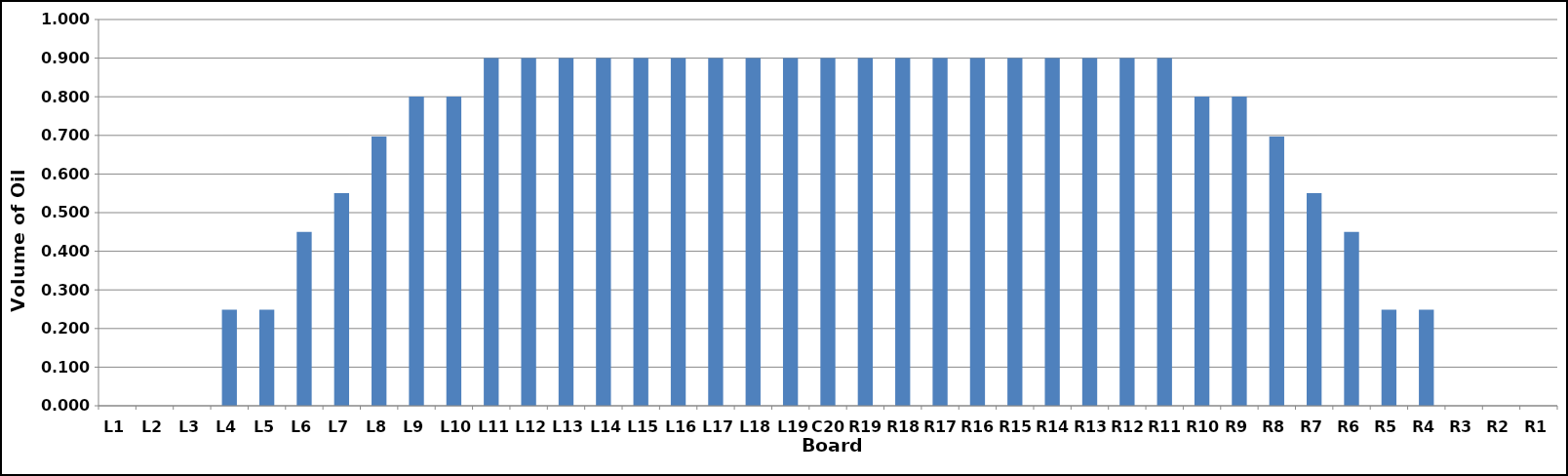
| Category | Series 0 |
|---|---|
| L1 | 0 |
| L2 | 0 |
| L3 | 0 |
| L4 | 0.249 |
| L5 | 0.249 |
| L6 | 0.45 |
| L7 | 0.551 |
| L8 | 0.697 |
| L9 | 0.801 |
| L10 | 0.801 |
| L11 | 0.9 |
| L12 | 0.9 |
| L13 | 0.9 |
| L14 | 0.9 |
| L15 | 0.9 |
| L16 | 0.9 |
| L17 | 0.9 |
| L18 | 0.9 |
| L19 | 0.9 |
| C20 | 0.9 |
| R19 | 0.9 |
| R18 | 0.9 |
| R17 | 0.9 |
| R16 | 0.9 |
| R15 | 0.9 |
| R14 | 0.9 |
| R13 | 0.9 |
| R12 | 0.9 |
| R11 | 0.9 |
| R10 | 0.801 |
| R9 | 0.801 |
| R8 | 0.697 |
| R7 | 0.551 |
| R6 | 0.45 |
| R5 | 0.249 |
| R4 | 0.249 |
| R3 | 0 |
| R2 | 0 |
| R1 | 0 |